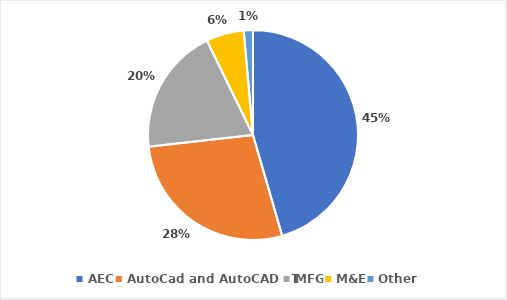
| Category | Series 0 |
|---|---|
| AEC | 2278 |
| AutoCad and AutoCAD LT | 1387 |
| MFG | 978 |
| M&E | 291 |
| Other | 71 |